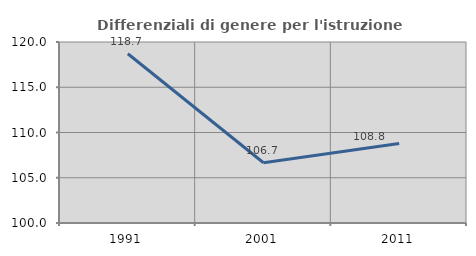
| Category | Differenziali di genere per l'istruzione superiore |
|---|---|
| 1991.0 | 118.702 |
| 2001.0 | 106.654 |
| 2011.0 | 108.789 |